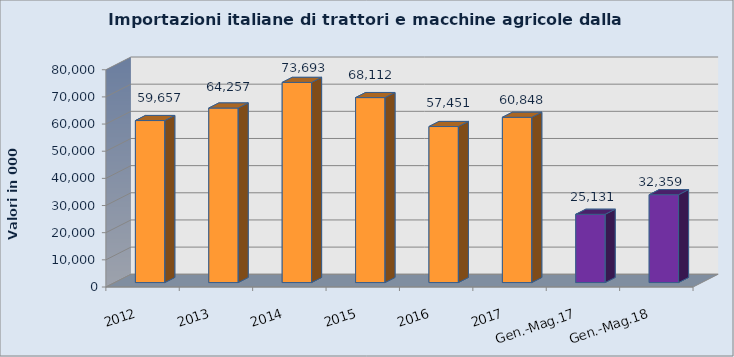
| Category | IMPORTS |
|---|---|
| 2012 | 59657.316 |
| 2013 | 64257.246 |
| 2014 | 73692.603 |
| 2015 | 68112 |
| 2016 | 57451 |
| 2017 | 60848 |
| Gen.-Mag.17 | 25131 |
| Gen.-Mag.18 | 32359 |